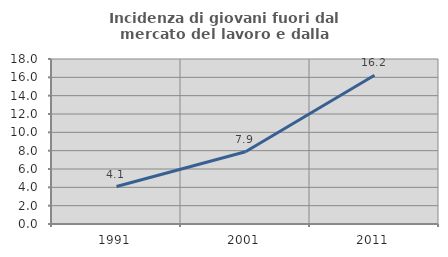
| Category | Incidenza di giovani fuori dal mercato del lavoro e dalla formazione  |
|---|---|
| 1991.0 | 4.087 |
| 2001.0 | 7.874 |
| 2011.0 | 16.23 |